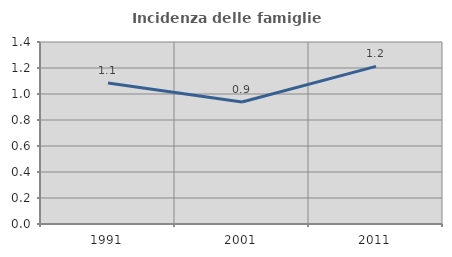
| Category | Incidenza delle famiglie numerose |
|---|---|
| 1991.0 | 1.084 |
| 2001.0 | 0.939 |
| 2011.0 | 1.212 |